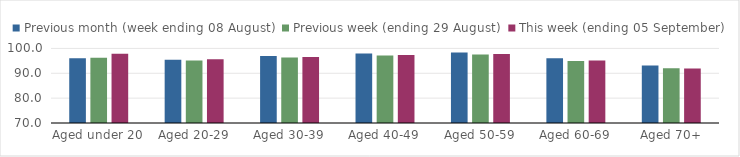
| Category | Previous month (week ending 08 August) | Previous week (ending 29 August) | This week (ending 05 September) |
|---|---|---|---|
| Aged under 20 | 96.02 | 96.3 | 97.82 |
| Aged 20-29 | 95.46 | 95.19 | 95.66 |
| Aged 30-39 | 96.91 | 96.33 | 96.55 |
| Aged 40-49 | 97.91 | 97.15 | 97.34 |
| Aged 50-59 | 98.39 | 97.53 | 97.76 |
| Aged 60-69 | 96.09 | 94.93 | 95.13 |
| Aged 70+ | 93.13 | 92.04 | 91.88 |